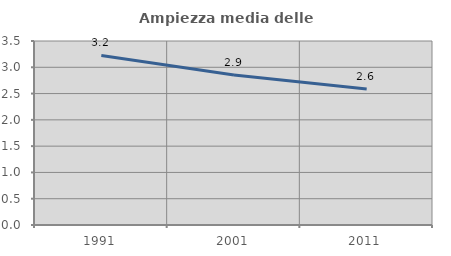
| Category | Ampiezza media delle famiglie |
|---|---|
| 1991.0 | 3.224 |
| 2001.0 | 2.851 |
| 2011.0 | 2.589 |